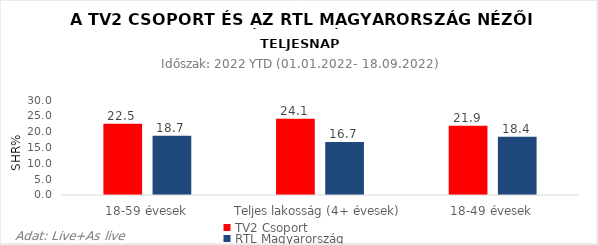
| Category | TV2 Csoport | RTL Magyarország |
|---|---|---|
| 18-59 évesek | 22.5 | 18.7 |
| Teljes lakosság (4+ évesek) | 24.1 | 16.7 |
| 18-49 évesek | 21.9 | 18.4 |